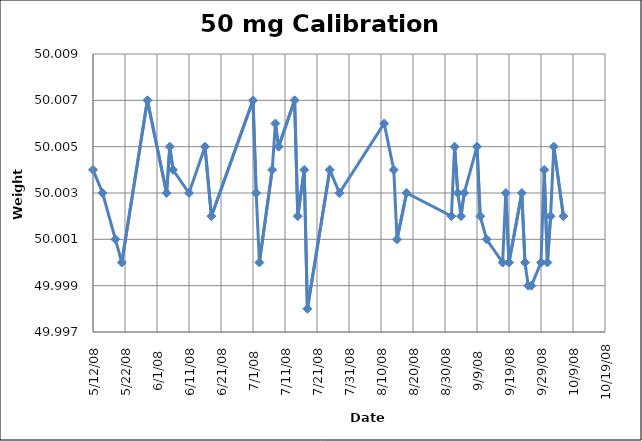
| Category | Series 0 |
|---|---|
| 39580.0 | 50.004 |
| 39583.0 | 50.003 |
| 39587.0 | 50.001 |
| 39589.0 | 50 |
| 39597.0 | 50.007 |
| 39603.0 | 50.003 |
| 39604.0 | 50.005 |
| 39605.0 | 50.004 |
| 39610.0 | 50.003 |
| 39615.0 | 50.005 |
| 39617.0 | 50.002 |
| 39630.0 | 50.007 |
| 39631.0 | 50.003 |
| 39632.0 | 50 |
| 39636.0 | 50.004 |
| 39637.0 | 50.006 |
| 39638.0 | 50.005 |
| 39643.0 | 50.007 |
| 39644.0 | 50.002 |
| 39646.0 | 50.004 |
| 39647.0 | 49.998 |
| 39654.0 | 50.004 |
| 39657.0 | 50.003 |
| 39671.0 | 50.006 |
| 39674.0 | 50.004 |
| 39675.0 | 50.001 |
| 39678.0 | 50.003 |
| 39692.0 | 50.002 |
| 39693.0 | 50.005 |
| 39694.0 | 50.003 |
| 39695.0 | 50.002 |
| 39696.0 | 50.003 |
| 39700.0 | 50.005 |
| 39701.0 | 50.002 |
| 39703.0 | 50.001 |
| 39708.0 | 50 |
| 39709.0 | 50.003 |
| 39710.0 | 50 |
| 39714.0 | 50.003 |
| 39715.0 | 50 |
| 39716.0 | 49.999 |
| 39717.0 | 49.999 |
| 39720.0 | 50 |
| 39721.0 | 50.004 |
| 39722.0 | 50 |
| 39723.0 | 50.002 |
| 39724.0 | 50.005 |
| 39727.0 | 50.002 |